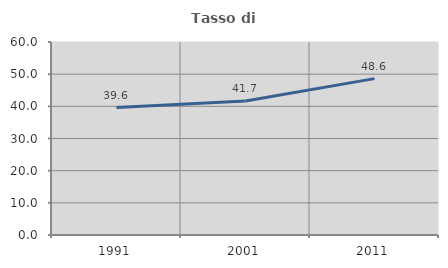
| Category | Tasso di occupazione   |
|---|---|
| 1991.0 | 39.634 |
| 2001.0 | 41.667 |
| 2011.0 | 48.619 |